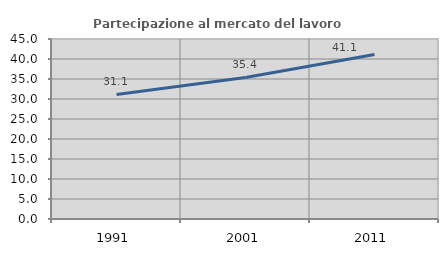
| Category | Partecipazione al mercato del lavoro  femminile |
|---|---|
| 1991.0 | 31.129 |
| 2001.0 | 35.381 |
| 2011.0 | 41.142 |